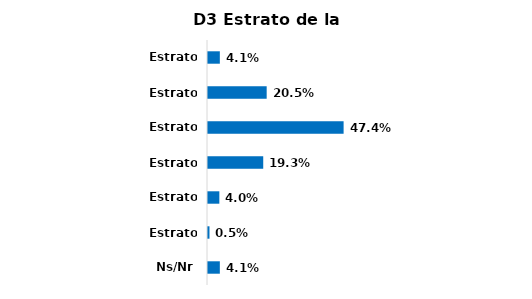
| Category | Series 0 |
|---|---|
| Estrato 1 | 0.041 |
| Estrato 2 | 0.205 |
| Estrato 3 | 0.474 |
| Estrato 4 | 0.193 |
| Estrato 5 | 0.04 |
| Estrato 6 | 0.005 |
| Ns/Nr | 0.041 |